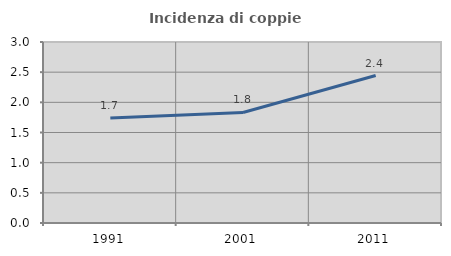
| Category | Incidenza di coppie miste |
|---|---|
| 1991.0 | 1.741 |
| 2001.0 | 1.832 |
| 2011.0 | 2.444 |